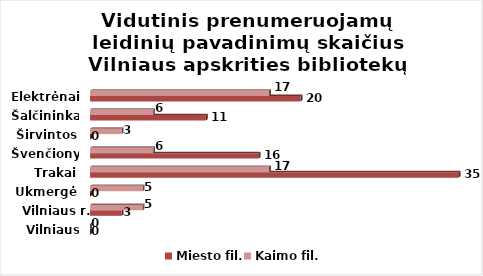
| Category | Miesto fil. | Kaimo fil. |
|---|---|---|
| Vilniaus m. | 0 | 0 |
| Vilniaus r. | 3 | 5 |
| Ukmergė | 0 | 5 |
| Trakai | 35 | 17 |
| Švenčionys | 16 | 6 |
| Širvintos | 0 | 3 |
| Šalčininkai | 11 | 6 |
| Elektrėnai | 20 | 17 |